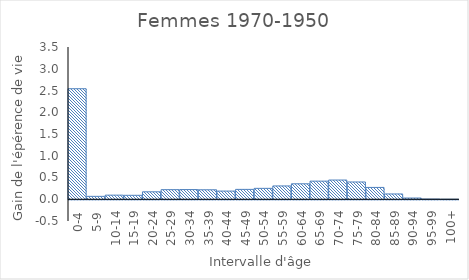
| Category | Femmes |
|---|---|
| 0-4 | 2.541 |
| 5-9 | 0.067 |
| 10-14 | 0.094 |
| 15-19 | 0.091 |
| 20-24 | 0.171 |
| 25-29 | 0.22 |
| 30-34 | 0.222 |
| 35-39 | 0.218 |
| 40-44 | 0.188 |
| 45-49 | 0.227 |
| 50-54 | 0.25 |
| 55-59 | 0.306 |
| 60-64 | 0.355 |
| 65-69 | 0.416 |
| 70-74 | 0.442 |
| 75-79 | 0.397 |
| 80-84 | 0.272 |
| 85-89 | 0.121 |
| 90-94 | 0.028 |
| 95-99 | 0.004 |
| 100+ | 0 |